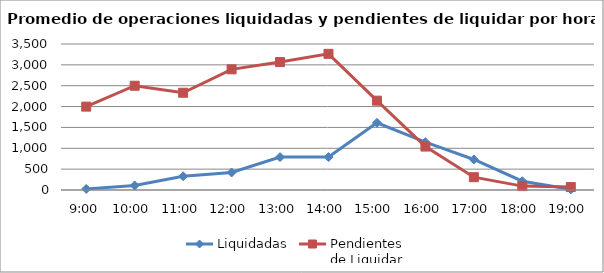
| Category | Liquidadas | Pendientes
de Liquidar |
|---|---|---|
| 0.375 | 25.381 | 1998.667 |
| 0.4166666666666667 | 107.524 | 2499.333 |
| 0.4583333333333333 | 329.952 | 2331.571 |
| 0.5 | 420.095 | 2892.619 |
| 0.5416666666666666 | 789.048 | 3066.905 |
| 0.583333333333333 | 788.714 | 3264 |
| 0.625 | 1610.762 | 2141.857 |
| 0.666666666666667 | 1146 | 1041.619 |
| 0.708333333333333 | 731.857 | 306.857 |
| 0.75 | 210.476 | 93 |
| 0.791666666666667 | 17.095 | 70.143 |